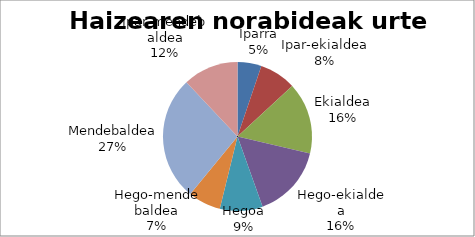
| Category | Series 0 |
|---|---|
| Iparra | 19 |
| Ipar-ekialdea | 29 |
| Ekialdea | 57 |
| Hego-ekialdea | 58 |
| Hegoa | 34 |
| Hego-mendebaldea | 26 |
| Mendebaldea | 99 |
| Ipar-mendebaldea | 44 |